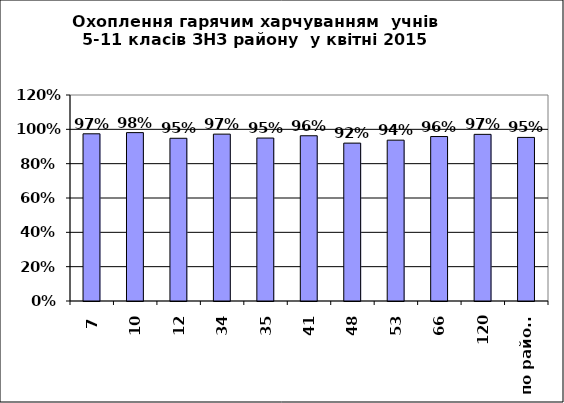
| Category | Series 0 |
|---|---|
| 7 | 0.974 |
| 10 | 0.981 |
| 12 | 0.948 |
| 34 | 0.972 |
| 35 | 0.949 |
| 41 | 0.963 |
| 48 | 0.92 |
| 53 | 0.937 |
| 66 | 0.958 |
| 120 | 0.971 |
| по району | 0.953 |